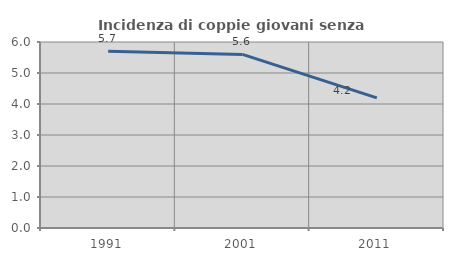
| Category | Incidenza di coppie giovani senza figli |
|---|---|
| 1991.0 | 5.702 |
| 2001.0 | 5.6 |
| 2011.0 | 4.198 |